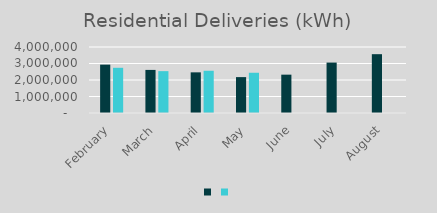
| Category | Series 1 | Series 0 |
|---|---|---|
| February | 2931022 | 2739688 |
| March | 2611486 | 2536769 |
| April | 2464085 | 2560197 |
| May | 2175066 | 2439036 |
| June | 2323720 | 0 |
| July | 3056084 | 0 |
| August | 3564883 | 0 |